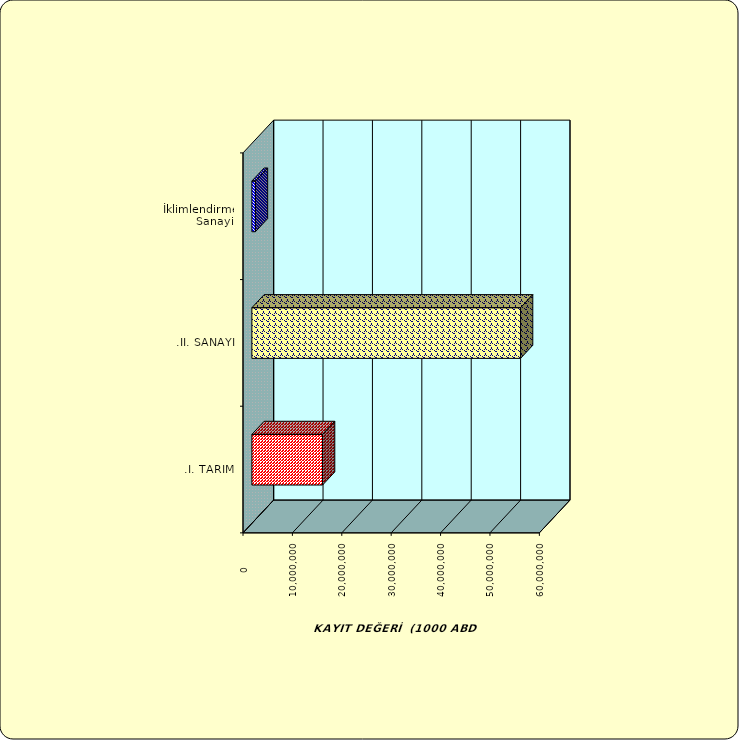
| Category | Series 0 |
|---|---|
| .I. TARIM | 14308780.441 |
| .II. SANAYİ | 54396135.648 |
|  İklimlendirme Sanayii | 714473.842 |